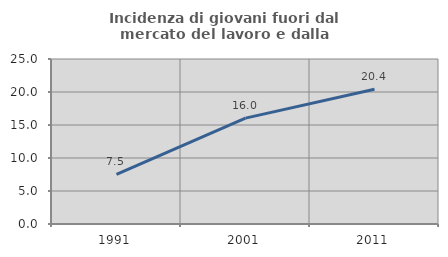
| Category | Incidenza di giovani fuori dal mercato del lavoro e dalla formazione  |
|---|---|
| 1991.0 | 7.514 |
| 2001.0 | 16.038 |
| 2011.0 | 20.408 |